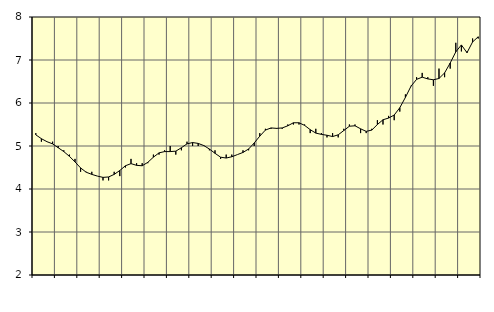
| Category | Piggar | Information och kommunikation, SNI 58-63 |
|---|---|---|
| nan | 5.3 | 5.26 |
| 1.0 | 5.1 | 5.17 |
| 1.0 | 5.1 | 5.1 |
| 1.0 | 5.1 | 5.05 |
| nan | 5 | 4.96 |
| 2.0 | 4.9 | 4.87 |
| 2.0 | 4.8 | 4.76 |
| 2.0 | 4.7 | 4.63 |
| nan | 4.4 | 4.49 |
| 3.0 | 4.4 | 4.39 |
| 3.0 | 4.4 | 4.34 |
| 3.0 | 4.3 | 4.3 |
| nan | 4.2 | 4.27 |
| 4.0 | 4.2 | 4.28 |
| 4.0 | 4.4 | 4.34 |
| 4.0 | 4.3 | 4.43 |
| nan | 4.5 | 4.54 |
| 5.0 | 4.7 | 4.59 |
| 5.0 | 4.6 | 4.55 |
| 5.0 | 4.6 | 4.54 |
| nan | 4.6 | 4.62 |
| 6.0 | 4.8 | 4.74 |
| 6.0 | 4.8 | 4.84 |
| 6.0 | 4.9 | 4.87 |
| nan | 5 | 4.87 |
| 7.0 | 4.8 | 4.88 |
| 7.0 | 4.9 | 4.96 |
| 7.0 | 5.1 | 5.05 |
| nan | 5 | 5.08 |
| 8.0 | 5 | 5.06 |
| 8.0 | 5 | 5.01 |
| 8.0 | 4.9 | 4.93 |
| nan | 4.9 | 4.83 |
| 9.0 | 4.7 | 4.74 |
| 9.0 | 4.8 | 4.72 |
| 9.0 | 4.8 | 4.75 |
| nan | 4.8 | 4.8 |
| 10.0 | 4.9 | 4.85 |
| 10.0 | 4.9 | 4.93 |
| 10.0 | 5 | 5.07 |
| nan | 5.3 | 5.23 |
| 11.0 | 5.4 | 5.37 |
| 11.0 | 5.4 | 5.42 |
| 11.0 | 5.4 | 5.41 |
| nan | 5.4 | 5.42 |
| 12.0 | 5.5 | 5.47 |
| 12.0 | 5.5 | 5.54 |
| 12.0 | 5.5 | 5.54 |
| nan | 5.5 | 5.48 |
| 13.0 | 5.3 | 5.38 |
| 13.0 | 5.4 | 5.3 |
| 13.0 | 5.3 | 5.27 |
| nan | 5.2 | 5.25 |
| 14.0 | 5.3 | 5.22 |
| 14.0 | 5.2 | 5.26 |
| 14.0 | 5.4 | 5.36 |
| nan | 5.5 | 5.46 |
| 15.0 | 5.5 | 5.47 |
| 15.0 | 5.3 | 5.4 |
| 15.0 | 5.3 | 5.34 |
| nan | 5.4 | 5.37 |
| 16.0 | 5.6 | 5.5 |
| 16.0 | 5.5 | 5.61 |
| 16.0 | 5.7 | 5.65 |
| nan | 5.6 | 5.72 |
| 17.0 | 5.8 | 5.89 |
| 17.0 | 6.2 | 6.13 |
| 17.0 | 6.4 | 6.39 |
| nan | 6.6 | 6.55 |
| 18.0 | 6.7 | 6.6 |
| 18.0 | 6.6 | 6.56 |
| 18.0 | 6.4 | 6.54 |
| nan | 6.8 | 6.57 |
| 19.0 | 6.6 | 6.7 |
| 19.0 | 6.8 | 6.93 |
| 19.0 | 7.4 | 7.19 |
| nan | 7.2 | 7.35 |
| 20.0 | 7.2 | 7.17 |
| 20.0 | 7.5 | 7.42 |
| 20.0 | 7.5 | 7.54 |